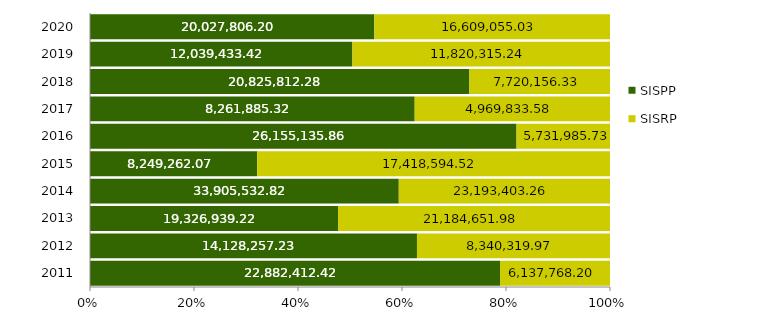
| Category | SISPP | SISRP |
|---|---|---|
| 2011.0 | 22882412.42 | 6137768.2 |
| 2012.0 | 14128257.23 | 8340319.97 |
| 2013.0 | 19326939.22 | 21184651.98 |
| 2014.0 | 33905532.82 | 23193403.26 |
| 2015.0 | 8249262.07 | 17418594.52 |
| 2016.0 | 26155135.86 | 5731985.73 |
| 2017.0 | 8261885.32 | 4969833.58 |
| 2018.0 | 20825812.28 | 7720156.33 |
| 2019.0 | 12039433.42 | 11820315.24 |
| 2020.0 | 20027806.2 | 16609055.03 |